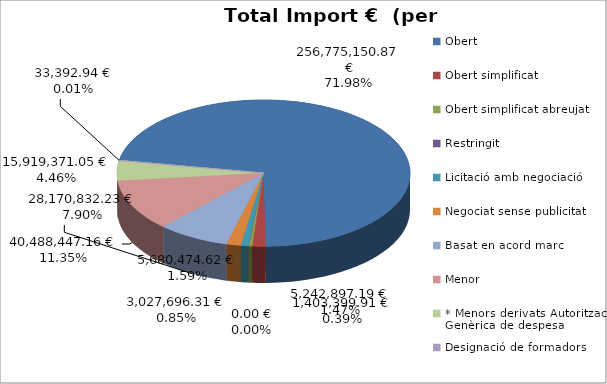
| Category | Total preu              (amb iva) |
|---|---|
| Obert | 256775150.87 |
| Obert simplificat | 5242897.19 |
| Obert simplificat abreujat | 1403399.91 |
| Restringit | 0 |
| Licitació amb negociació | 3027696.31 |
| Negociat sense publicitat | 5680474.62 |
| Basat en acord marc | 28170832.23 |
| Menor | 40488447.16 |
| * Menors derivats Autorització Genèrica de despesa | 15919371.05 |
| Designació de formadors | 33392.94 |